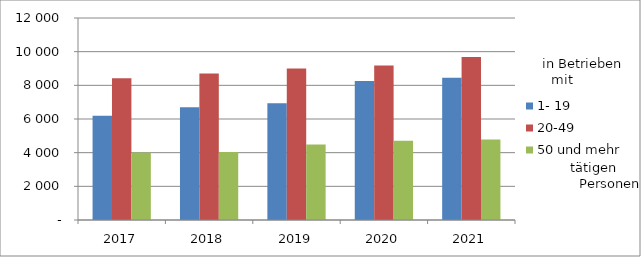
| Category | 1- 19 | 20-49 | 50 und mehr |
|---|---|---|---|
| 2017.0 | 6188 | 8425 | 4004 |
| 2018.0 | 6705 | 8702 | 4036 |
| 2019.0 | 6930 | 9003 | 4480 |
| 2020.0 | 8255 | 9178 | 4705 |
| 2021.0 | 8454 | 9679 | 4778 |